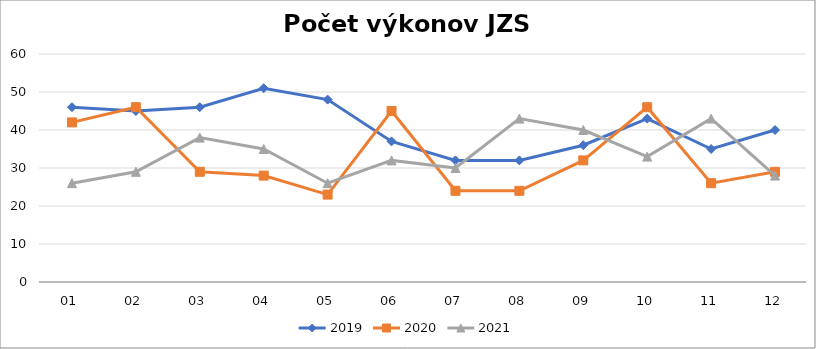
| Category | 2019 | 2020 | 2021 |
|---|---|---|---|
| 01 | 46 | 42 | 26 |
| 02 | 45 | 46 | 29 |
| 03 | 46 | 29 | 38 |
| 04 | 51 | 28 | 35 |
| 05 | 48 | 23 | 26 |
| 06 | 37 | 45 | 32 |
| 07 | 32 | 24 | 30 |
| 08 | 32 | 24 | 43 |
| 09 | 36 | 32 | 40 |
| 10 | 43 | 46 | 33 |
| 11 | 35 | 26 | 43 |
| 12 | 40 | 29 | 28 |